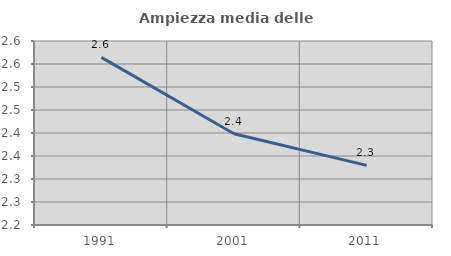
| Category | Ampiezza media delle famiglie |
|---|---|
| 1991.0 | 2.564 |
| 2001.0 | 2.398 |
| 2011.0 | 2.33 |